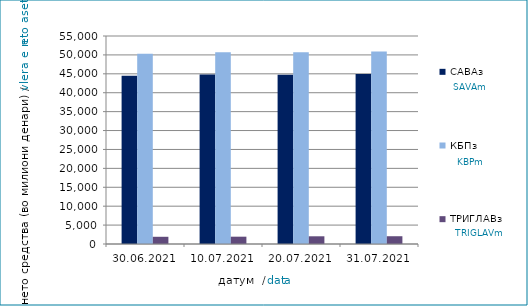
| Category | САВАз | КБПз | ТРИГЛАВз |
|---|---|---|---|
| 2021-06-30 | 44463.479 | 50335.923 | 1908.695 |
| 2021-07-10 | 44821.554 | 50718.4 | 1934.036 |
| 2021-07-20 | 44748.159 | 50674.388 | 2039.205 |
| 2021-07-31 | 44933.878 | 50873.84 | 2054.579 |